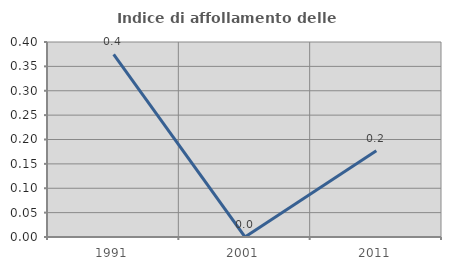
| Category | Indice di affollamento delle abitazioni  |
|---|---|
| 1991.0 | 0.375 |
| 2001.0 | 0 |
| 2011.0 | 0.177 |